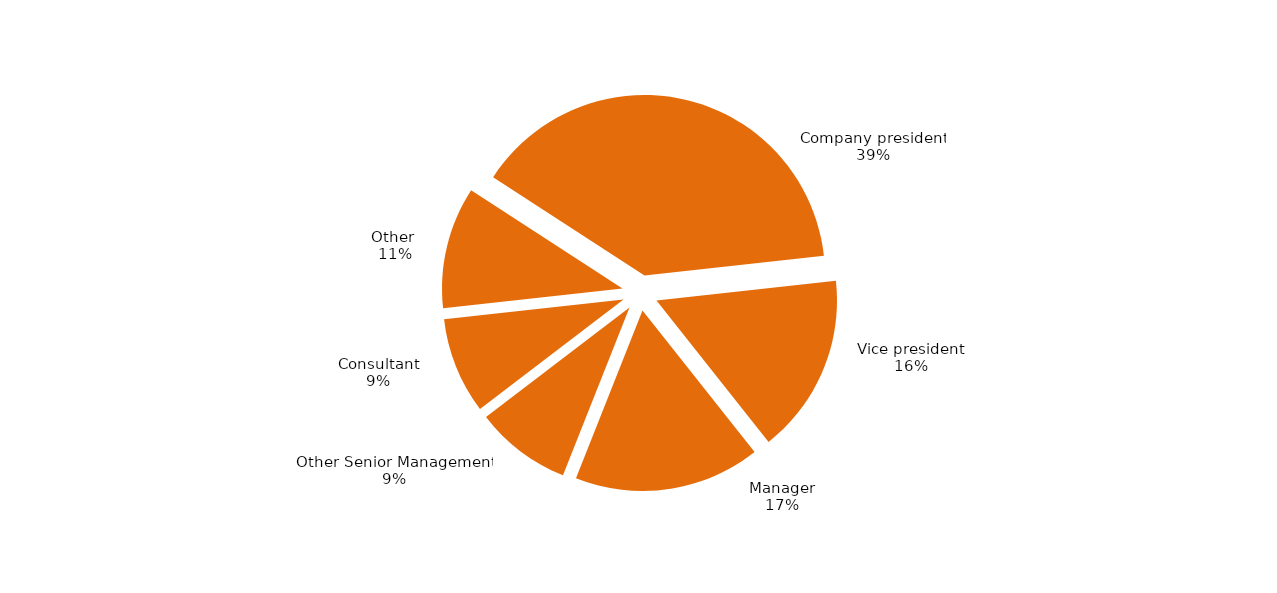
| Category | Series 0 |
|---|---|
| Company president | 0.391 |
| Vice president | 0.161 |
| Manager | 0.167 |
| Other Senior Management | 0.086 |
| Consultant | 0.086 |
| Other  | 0.109 |